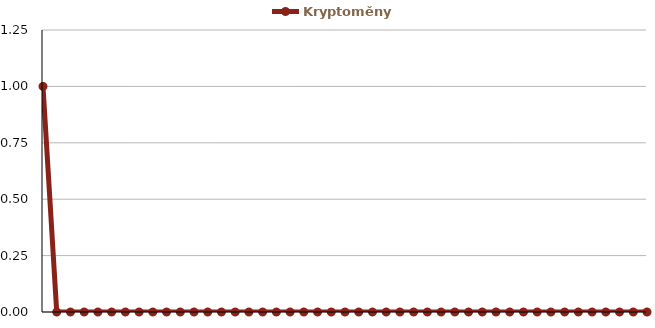
| Category | Kryptoměny |
|---|---|
| 0 | 1 |
| 1 | 0 |
| 2 | 0 |
| 3 | 0 |
| 4 | 0 |
| 5 | 0 |
| 6 | 0 |
| 7 | 0 |
| 8 | 0 |
| 9 | 0 |
| 10 | 0 |
| 11 | 0 |
| 12 | 0 |
| 13 | 0 |
| 14 | 0 |
| 15 | 0 |
| 16 | 0 |
| 17 | 0 |
| 18 | 0 |
| 19 | 0 |
| 20 | 0 |
| 21 | 0 |
| 22 | 0 |
| 23 | 0 |
| 24 | 0 |
| 25 | 0 |
| 26 | 0 |
| 27 | 0 |
| 28 | 0 |
| 29 | 0 |
| 30 | 0 |
| 31 | 0 |
| 32 | 0 |
| 33 | 0 |
| 34 | 0 |
| 35 | 0 |
| 36 | 0 |
| 37 | 0 |
| 38 | 0 |
| 39 | 0 |
| 40 | 0 |
| 41 | 0 |
| 42 | 0 |
| 43 | 0 |
| 44 | 0 |